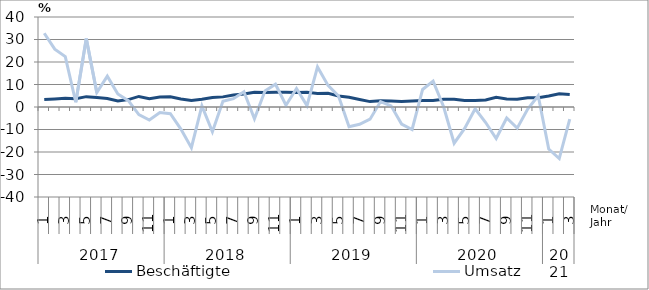
| Category | Beschäftigte | Umsatz |
|---|---|---|
| 0 | 3.3 | 32.8 |
| 1 | 3.6 | 25.7 |
| 2 | 3.9 | 22.4 |
| 3 | 3.7 | 2.1 |
| 4 | 4.6 | 30.4 |
| 5 | 4.2 | 6.4 |
| 6 | 3.8 | 13.7 |
| 7 | 2.7 | 5.8 |
| 8 | 3.3 | 2.8 |
| 9 | 4.7 | -3.4 |
| 10 | 3.7 | -5.8 |
| 11 | 4.4 | -2.5 |
| 12 | 4.5 | -3 |
| 13 | 3.6 | -9.8 |
| 14 | 2.9 | -18.1 |
| 15 | 3.4 | 0.5 |
| 16 | 4.2 | -11 |
| 17 | 4.5 | 2.5 |
| 18 | 5.3 | 3.7 |
| 19 | 5.8 | 6.8 |
| 20 | 6.6 | -5.2 |
| 21 | 6.5 | 7.1 |
| 22 | 6.6 | 10.1 |
| 23 | 6.6 | 0.8 |
| 24 | 6.4 | 8.2 |
| 25 | 6.5 | 0.6 |
| 26 | 6 | 17.8 |
| 27 | 6.1 | 9.6 |
| 28 | 4.9 | 4.9 |
| 29 | 4.3 | -8.8 |
| 30 | 3.3 | -7.7 |
| 31 | 2.4 | -5.4 |
| 32 | 2.8 | 2.4 |
| 33 | 2.7 | 0.5 |
| 34 | 2.5 | -7.6 |
| 35 | 2.7 | -10 |
| 36 | 2.9 | 7.8 |
| 37 | 2.9 | 11.5 |
| 38 | 3.4 | 0.1 |
| 39 | 3.4 | -16.1 |
| 40 | 2.9 | -9.5 |
| 41 | 2.9 | -0.8 |
| 42 | 3.1 | -6.9 |
| 43 | 4.3 | -14 |
| 44 | 3.6 | -4.9 |
| 45 | 3.4 | -9.4 |
| 46 | 4.1 | -0.9 |
| 47 | 4.1 | 5 |
| 48 | 4.9 | -18.7 |
| 49 | 5.9 | -22.9 |
| 50 | 5.6 | -5.4 |